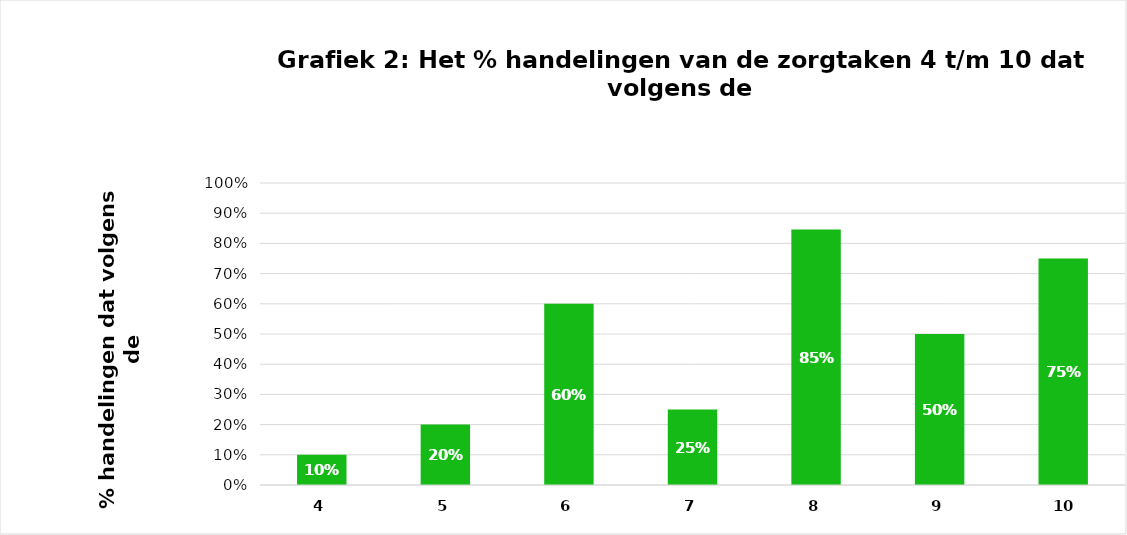
| Category | Series 0 |
|---|---|
| 4.0 | 0.1 |
| 5.0 | 0.2 |
| 6.0 | 0.6 |
| 7.0 | 0.25 |
| 8.0 | 0.846 |
| 9.0 | 0.5 |
| 10.0 | 0.75 |